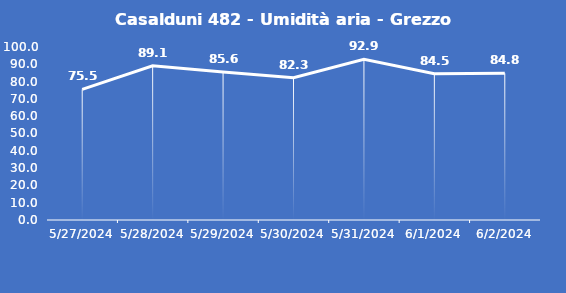
| Category | Casalduni 482 - Umidità aria - Grezzo (%) |
|---|---|
| 5/27/24 | 75.5 |
| 5/28/24 | 89.1 |
| 5/29/24 | 85.6 |
| 5/30/24 | 82.3 |
| 5/31/24 | 92.9 |
| 6/1/24 | 84.5 |
| 6/2/24 | 84.8 |